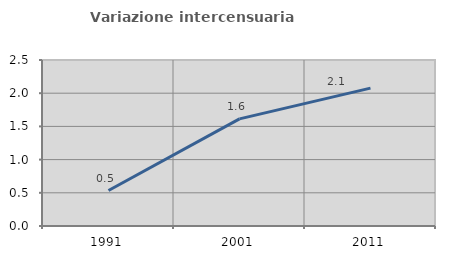
| Category | Variazione intercensuaria annua |
|---|---|
| 1991.0 | 0.535 |
| 2001.0 | 1.613 |
| 2011.0 | 2.077 |